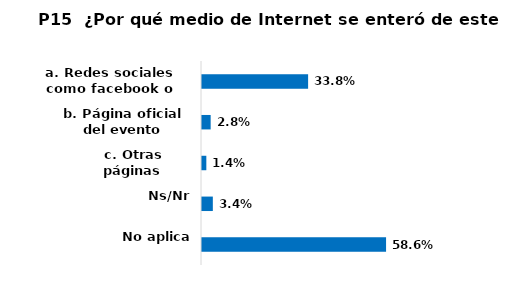
| Category | Series 0 |
|---|---|
| a. Redes sociales como facebook o Twitter | 0.338 |
| b. Página oficial del evento | 0.028 |
| c. Otras páginas | 0.014 |
| Ns/Nr | 0.034 |
| No aplica | 0.586 |